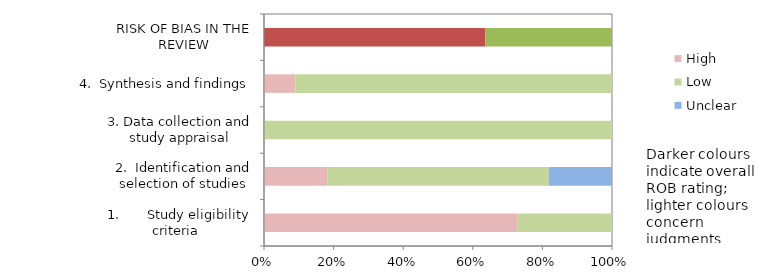
| Category | High | Low | Unclear |
|---|---|---|---|
| 1.       Study eligibility criteria   | 8 | 3 | 0 |
| 2.  Identification and selection of studies | 2 | 7 | 2 |
| 3. Data collection and study appraisal | 0 | 11 | 0 |
| 4.  Synthesis and findings | 1 | 10 | 0 |
| RISK OF BIAS IN THE REVIEW | 7 | 4 | 0 |